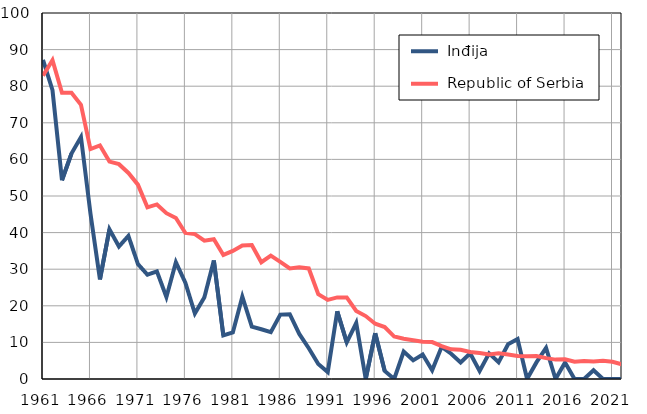
| Category |  Inđija |  Republic of Serbia |
|---|---|---|
| 1961.0 | 87.2 | 82.9 |
| 1962.0 | 78.9 | 87.1 |
| 1963.0 | 54.3 | 78.2 |
| 1964.0 | 61.6 | 78.2 |
| 1965.0 | 66.1 | 74.9 |
| 1966.0 | 45.2 | 62.8 |
| 1967.0 | 27.2 | 63.8 |
| 1968.0 | 40.9 | 59.4 |
| 1969.0 | 36.2 | 58.7 |
| 1970.0 | 39.1 | 56.3 |
| 1971.0 | 31.4 | 53.1 |
| 1972.0 | 28.5 | 46.9 |
| 1973.0 | 29.4 | 47.7 |
| 1974.0 | 22.4 | 45.3 |
| 1975.0 | 31.9 | 44 |
| 1976.0 | 26.3 | 39.9 |
| 1977.0 | 17.9 | 39.6 |
| 1978.0 | 22.3 | 37.8 |
| 1979.0 | 32.4 | 38.2 |
| 1980.0 | 11.9 | 33.9 |
| 1981.0 | 12.7 | 35 |
| 1982.0 | 22.5 | 36.5 |
| 1983.0 | 14.3 | 36.6 |
| 1984.0 | 13.6 | 31.9 |
| 1985.0 | 12.8 | 33.7 |
| 1986.0 | 17.6 | 32 |
| 1987.0 | 17.7 | 30.2 |
| 1988.0 | 12.3 | 30.5 |
| 1989.0 | 8.4 | 30.2 |
| 1990.0 | 4.1 | 23.2 |
| 1991.0 | 1.9 | 21.6 |
| 1992.0 | 18.5 | 22.3 |
| 1993.0 | 10 | 22.3 |
| 1994.0 | 15.3 | 18.6 |
| 1995.0 | 0 | 17.2 |
| 1996.0 | 12.5 | 15.1 |
| 1997.0 | 2.2 | 14.2 |
| 1998.0 | 0 | 11.6 |
| 1999.0 | 7.5 | 11 |
| 2000.0 | 5.1 | 10.6 |
| 2001.0 | 6.7 | 10.2 |
| 2002.0 | 2.4 | 10.1 |
| 2003.0 | 8.8 | 9 |
| 2004.0 | 6.9 | 8.1 |
| 2005.0 | 4.5 | 8 |
| 2006.0 | 7 | 7.4 |
| 2007.0 | 2.2 | 7.1 |
| 2008.0 | 7 | 6.7 |
| 2009.0 | 4.6 | 7 |
| 2010.0 | 9.5 | 6.7 |
| 2011.0 | 10.9 | 6.3 |
| 2012.0 | 0 | 6.2 |
| 2013.0 | 4.6 | 6.3 |
| 2014.0 | 8.5 | 5.7 |
| 2015.0 | 0 | 5.3 |
| 2016.0 | 4.5 | 5.4 |
| 2017.0 | 0 | 4.7 |
| 2018.0 | 0 | 4.9 |
| 2019.0 | 2.4 | 4.8 |
| 2020.0 | 0 | 5 |
| 2021.0 | 0 | 4.7 |
| 2022.0 | 0 | 4 |